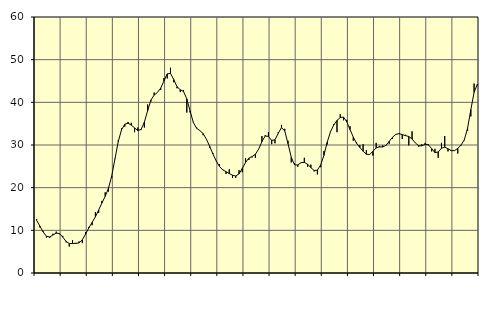
| Category | Piggar | Series 1 |
|---|---|---|
| nan | 12.6 | 12.34 |
| 87.0 | 10.7 | 10.99 |
| 87.0 | 9.8 | 9.62 |
| 87.0 | 8.3 | 8.6 |
| nan | 8.2 | 8.44 |
| 88.0 | 9.2 | 8.91 |
| 88.0 | 9.7 | 9.34 |
| 88.0 | 9.1 | 9.24 |
| nan | 8.7 | 8.41 |
| 89.0 | 7.2 | 7.41 |
| 89.0 | 6.2 | 6.91 |
| 89.0 | 7.7 | 6.91 |
| nan | 6.8 | 6.97 |
| 90.0 | 7.4 | 7.05 |
| 90.0 | 7 | 7.78 |
| 90.0 | 9.6 | 9.13 |
| nan | 10.8 | 10.58 |
| 91.0 | 11.2 | 11.87 |
| 91.0 | 14.3 | 13.16 |
| 91.0 | 14.1 | 14.77 |
| nan | 16.9 | 16.41 |
| 92.0 | 18.9 | 17.96 |
| 92.0 | 19.1 | 19.85 |
| 92.0 | 22.3 | 22.74 |
| nan | 26.7 | 26.79 |
| 93.0 | 31.1 | 30.8 |
| 93.0 | 33.9 | 33.57 |
| 93.0 | 34.3 | 34.88 |
| nan | 35.4 | 35.1 |
| 94.0 | 35.2 | 34.65 |
| 94.0 | 33 | 34 |
| 94.0 | 34.1 | 33.38 |
| nan | 33.5 | 33.66 |
| 95.0 | 34.1 | 35.36 |
| 95.0 | 39.5 | 38.02 |
| 95.0 | 40.2 | 40.53 |
| nan | 42.3 | 41.7 |
| 96.0 | 42.3 | 42.32 |
| 96.0 | 42.9 | 43.32 |
| 96.0 | 45.7 | 45.01 |
| nan | 45.6 | 46.67 |
| 97.0 | 48.1 | 46.8 |
| 97.0 | 44.7 | 45.34 |
| 97.0 | 43.3 | 43.65 |
| nan | 42.4 | 42.96 |
| 98.0 | 42.9 | 42.54 |
| 98.0 | 37.6 | 40.8 |
| 98.0 | 37.6 | 37.98 |
| nan | 35.4 | 35.29 |
| 99.0 | 34.1 | 33.92 |
| 99.0 | 33.4 | 33.38 |
| 99.0 | 32.3 | 32.67 |
| nan | 31.3 | 31.37 |
| 0.0 | 29.4 | 29.7 |
| 0.0 | 28.1 | 27.88 |
| 0.0 | 26.2 | 26.28 |
| nan | 25.5 | 24.98 |
| 1.0 | 24.3 | 24.17 |
| 1.0 | 23.2 | 23.75 |
| 1.0 | 24.3 | 23.31 |
| nan | 22.3 | 22.92 |
| 2.0 | 22.3 | 22.72 |
| 2.0 | 24.1 | 23.24 |
| 2.0 | 23.6 | 24.52 |
| nan | 26.9 | 25.93 |
| 3.0 | 26.5 | 26.91 |
| 3.0 | 27.1 | 27.3 |
| 3.0 | 27 | 27.82 |
| nan | 29 | 29.02 |
| 4.0 | 32.1 | 30.78 |
| 4.0 | 32.3 | 32.12 |
| 4.0 | 33 | 32 |
| nan | 30.2 | 31.09 |
| 5.0 | 30.4 | 31.21 |
| 5.0 | 33 | 32.73 |
| 5.0 | 34.7 | 34.08 |
| nan | 33.8 | 33.29 |
| 6.0 | 31 | 30.32 |
| 6.0 | 25.9 | 27.1 |
| 6.0 | 25.7 | 25.34 |
| nan | 24.9 | 25.33 |
| 7.0 | 25.9 | 25.88 |
| 7.0 | 27 | 25.92 |
| 7.0 | 24.9 | 25.5 |
| nan | 25.4 | 24.69 |
| 8.0 | 23.8 | 24.02 |
| 8.0 | 23.1 | 24.1 |
| 8.0 | 24.8 | 25.31 |
| nan | 28.6 | 27.6 |
| 9.0 | 30.1 | 30.63 |
| 9.0 | 33 | 33.09 |
| 9.0 | 34.9 | 34.67 |
| nan | 33 | 35.76 |
| 10.0 | 37.2 | 36.45 |
| 10.0 | 35.8 | 36.54 |
| 10.0 | 35.9 | 35.43 |
| nan | 34.4 | 33.62 |
| 11.0 | 31 | 31.84 |
| 11.0 | 30.6 | 30.4 |
| 11.0 | 30 | 29.43 |
| nan | 30.2 | 28.54 |
| 12.0 | 28.8 | 27.83 |
| 12.0 | 27.7 | 27.76 |
| 12.0 | 27.5 | 28.53 |
| nan | 30.5 | 29.32 |
| 13.0 | 29.8 | 29.55 |
| 13.0 | 29.9 | 29.53 |
| 13.0 | 29.8 | 29.92 |
| nan | 30.3 | 30.85 |
| 14.0 | 31.4 | 31.81 |
| 14.0 | 32.4 | 32.47 |
| 14.0 | 32.8 | 32.67 |
| nan | 31.4 | 32.43 |
| 15.0 | 32.4 | 32.19 |
| 15.0 | 29.9 | 32 |
| 15.0 | 33.2 | 31.4 |
| nan | 30.5 | 30.48 |
| 16.0 | 29.6 | 29.83 |
| 16.0 | 30.2 | 29.8 |
| 16.0 | 30.5 | 30.15 |
| nan | 30.2 | 30.03 |
| 17.0 | 28.5 | 29.16 |
| 17.0 | 29.1 | 28.22 |
| 17.0 | 27 | 28.37 |
| nan | 30.5 | 29.23 |
| 18.0 | 32.1 | 29.51 |
| 18.0 | 28.5 | 29.12 |
| 18.0 | 28.8 | 28.68 |
| nan | 28.7 | 28.68 |
| 19.0 | 28 | 29.21 |
| 19.0 | 29.9 | 30 |
| 19.0 | 31.1 | 31.21 |
| nan | 33.3 | 33.92 |
| 20.0 | 36.7 | 38.29 |
| 20.0 | 44.4 | 42.34 |
| 20.0 | 44 | 44.24 |